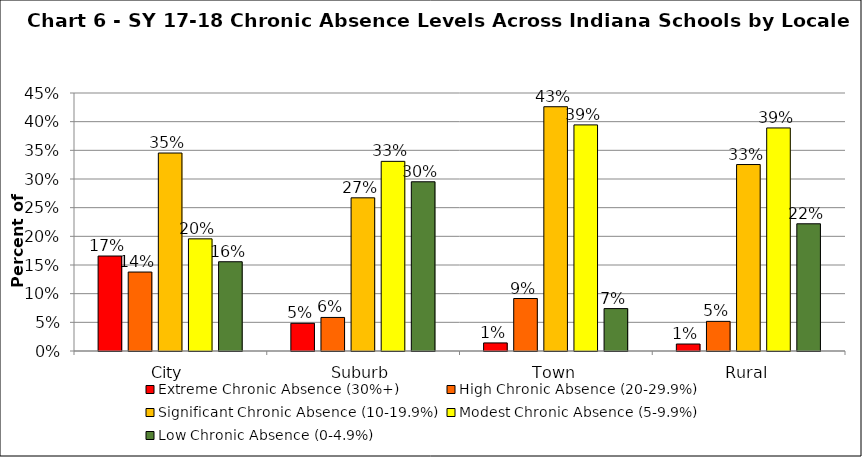
| Category | Extreme Chronic Absence (30%+) | High Chronic Absence (20-29.9%) | Significant Chronic Absence (10-19.9%) | Modest Chronic Absence (5-9.9%) | Low Chronic Absence (0-4.9%) |
|---|---|---|---|---|---|
| 0 | 0.166 | 0.138 | 0.345 | 0.196 | 0.156 |
| 1 | 0.048 | 0.059 | 0.267 | 0.331 | 0.295 |
| 2 | 0.014 | 0.092 | 0.426 | 0.394 | 0.074 |
| 3 | 0.012 | 0.052 | 0.325 | 0.389 | 0.222 |